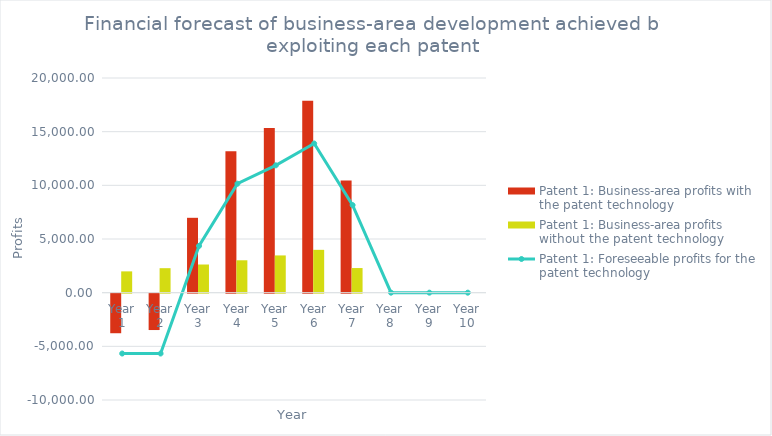
| Category | Patent 1: Business-area profits with the patent technology | Patent 1: Business-area profits without the patent technology |
|---|---|---|
| Year 1 | -3686.25 | 1983.75 |
| Year 2 | -3388.688 | 2281.312 |
| Year 3 | 6975.124 | 2623.509 |
| Year 4 | 13169.391 | 3017.036 |
| Year 5 | 15334.765 | 3469.591 |
| Year 6 | 17886.209 | 3990.03 |
| Year 7 | 10450.696 | 2294.267 |
| Year 8 | 0 | 0 |
| Year 9 | 0 | 0 |
| Year 10 | 0 | 0 |